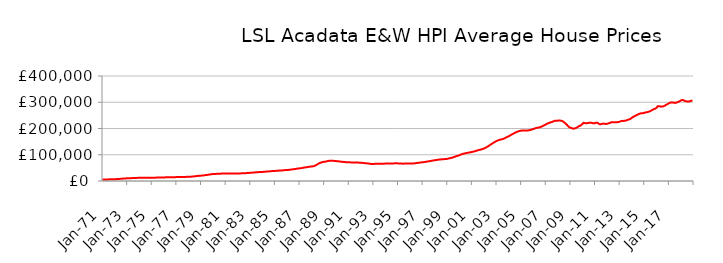
| Category | Series 0 |
|---|---|
| 1971-01-01 | 5778.581 |
| 1971-02-01 | 5819.644 |
| 1971-03-01 | 5861.052 |
| 1971-04-01 | 5914.887 |
| 1971-05-01 | 6004.226 |
| 1971-06-01 | 6097.324 |
| 1971-07-01 | 6211.806 |
| 1971-08-01 | 6336.376 |
| 1971-09-01 | 6459.952 |
| 1971-10-01 | 6588.334 |
| 1971-11-01 | 6726.925 |
| 1971-12-01 | 6895.683 |
| 1972-01-01 | 7012.816 |
| 1972-02-01 | 7089.505 |
| 1972-03-01 | 7264.068 |
| 1972-04-01 | 7508.171 |
| 1972-05-01 | 7860.864 |
| 1972-06-01 | 8170.355 |
| 1972-07-01 | 8526.19 |
| 1972-08-01 | 8869.45 |
| 1972-09-01 | 9172.546 |
| 1972-10-01 | 9455.81 |
| 1972-11-01 | 9718.109 |
| 1972-12-01 | 9988.703 |
| 1973-01-01 | 10182.281 |
| 1973-02-01 | 10319.059 |
| 1973-03-01 | 10476.299 |
| 1973-04-01 | 10655.658 |
| 1973-05-01 | 10885.617 |
| 1973-06-01 | 11035.023 |
| 1973-07-01 | 11191.497 |
| 1973-08-01 | 11365.076 |
| 1973-09-01 | 11567.646 |
| 1973-10-01 | 11777.671 |
| 1973-11-01 | 11937.725 |
| 1973-12-01 | 12052.498 |
| 1974-01-01 | 12114.056 |
| 1974-02-01 | 12180.401 |
| 1974-03-01 | 12177.683 |
| 1974-04-01 | 12151.396 |
| 1974-05-01 | 12128.2 |
| 1974-06-01 | 12129.044 |
| 1974-07-01 | 12140.839 |
| 1974-08-01 | 12180.432 |
| 1974-09-01 | 12252.457 |
| 1974-10-01 | 12340.928 |
| 1974-11-01 | 12414.246 |
| 1974-12-01 | 12486.63 |
| 1975-01-01 | 12520.118 |
| 1975-02-01 | 12562.362 |
| 1975-03-01 | 12637.333 |
| 1975-04-01 | 12744.087 |
| 1975-05-01 | 12873.689 |
| 1975-06-01 | 12943.075 |
| 1975-07-01 | 13011.113 |
| 1975-08-01 | 13105.055 |
| 1975-09-01 | 13232.189 |
| 1975-10-01 | 13373.438 |
| 1975-11-01 | 13497.805 |
| 1975-12-01 | 13630.81 |
| 1976-01-01 | 13724.455 |
| 1976-02-01 | 13812.644 |
| 1976-03-01 | 13872.986 |
| 1976-04-01 | 13937.169 |
| 1976-05-01 | 14021.143 |
| 1976-06-01 | 14076.084 |
| 1976-07-01 | 14136.858 |
| 1976-08-01 | 14226.8 |
| 1976-09-01 | 14355.517 |
| 1976-10-01 | 14500.583 |
| 1976-11-01 | 14616.658 |
| 1976-12-01 | 14720.316 |
| 1977-01-01 | 14777.952 |
| 1977-02-01 | 14844.144 |
| 1977-03-01 | 14887.065 |
| 1977-04-01 | 14937.409 |
| 1977-05-01 | 15015.166 |
| 1977-06-01 | 15085.676 |
| 1977-07-01 | 15172.371 |
| 1977-08-01 | 15291.274 |
| 1977-09-01 | 15436.686 |
| 1977-10-01 | 15600.493 |
| 1977-11-01 | 15773.788 |
| 1977-12-01 | 15999.984 |
| 1978-01-01 | 16167.959 |
| 1978-02-01 | 16299.061 |
| 1978-03-01 | 16475.734 |
| 1978-04-01 | 16713.402 |
| 1978-05-01 | 17094.413 |
| 1978-06-01 | 17479.975 |
| 1978-07-01 | 17946.292 |
| 1978-08-01 | 18424.608 |
| 1978-09-01 | 18884.941 |
| 1978-10-01 | 19342.68 |
| 1978-11-01 | 19769.516 |
| 1978-12-01 | 20191.255 |
| 1979-01-01 | 20442.13 |
| 1979-02-01 | 20610.397 |
| 1979-03-01 | 21029.54 |
| 1979-04-01 | 21604.081 |
| 1979-05-01 | 22337.281 |
| 1979-06-01 | 22802.563 |
| 1979-07-01 | 23285.495 |
| 1979-08-01 | 23829.32 |
| 1979-09-01 | 24480.85 |
| 1979-10-01 | 25176.324 |
| 1979-11-01 | 25755.381 |
| 1979-12-01 | 26205.315 |
| 1980-01-01 | 26452.337 |
| 1980-02-01 | 26644.34 |
| 1980-03-01 | 26890.696 |
| 1980-04-01 | 27179.161 |
| 1980-05-01 | 27516.6 |
| 1980-06-01 | 27697.106 |
| 1980-07-01 | 27860.786 |
| 1980-08-01 | 28012.05 |
| 1980-09-01 | 28118.706 |
| 1980-10-01 | 28187.005 |
| 1980-11-01 | 28239.499 |
| 1980-12-01 | 28351.177 |
| 1981-01-01 | 28417.565 |
| 1981-02-01 | 28518.272 |
| 1981-03-01 | 28619.251 |
| 1981-04-01 | 28754.782 |
| 1981-05-01 | 28892.195 |
| 1981-06-01 | 28938.816 |
| 1981-07-01 | 28961.048 |
| 1981-08-01 | 28966.541 |
| 1981-09-01 | 28911.984 |
| 1981-10-01 | 28812.42 |
| 1981-11-01 | 28721.014 |
| 1981-12-01 | 28711.063 |
| 1982-01-01 | 28666.699 |
| 1982-02-01 | 28686.129 |
| 1982-03-01 | 28845.213 |
| 1982-04-01 | 29113.24 |
| 1982-05-01 | 29413.475 |
| 1982-06-01 | 29523.039 |
| 1982-07-01 | 29605.704 |
| 1982-08-01 | 29763.338 |
| 1982-09-01 | 30018.943 |
| 1982-10-01 | 30322.622 |
| 1982-11-01 | 30625.169 |
| 1982-12-01 | 31000.37 |
| 1983-01-01 | 31285.472 |
| 1983-02-01 | 31530.496 |
| 1983-03-01 | 31785.806 |
| 1983-04-01 | 32102.207 |
| 1983-05-01 | 32517.182 |
| 1983-06-01 | 32842.832 |
| 1983-07-01 | 33197.41 |
| 1983-08-01 | 33534.274 |
| 1983-09-01 | 33803.554 |
| 1983-10-01 | 34023.857 |
| 1983-11-01 | 34231.746 |
| 1983-12-01 | 34504.784 |
| 1984-01-01 | 34667.972 |
| 1984-02-01 | 34833.654 |
| 1984-03-01 | 35148.221 |
| 1984-04-01 | 35584.586 |
| 1984-05-01 | 36084.097 |
| 1984-06-01 | 36305.56 |
| 1984-07-01 | 36490.904 |
| 1984-08-01 | 36773.294 |
| 1984-09-01 | 37223.913 |
| 1984-10-01 | 37745.264 |
| 1984-11-01 | 38148.207 |
| 1984-12-01 | 38428.254 |
| 1985-01-01 | 38505.993 |
| 1985-02-01 | 38613.431 |
| 1985-03-01 | 38877.562 |
| 1985-04-01 | 39248.564 |
| 1985-05-01 | 39672.187 |
| 1985-06-01 | 39835.893 |
| 1985-07-01 | 39987.238 |
| 1985-08-01 | 40249.596 |
| 1985-09-01 | 40687.139 |
| 1985-10-01 | 41186.844 |
| 1985-11-01 | 41606.839 |
| 1985-12-01 | 41942.748 |
| 1986-01-01 | 42073.314 |
| 1986-02-01 | 42206.626 |
| 1986-03-01 | 42596.037 |
| 1986-04-01 | 43159.332 |
| 1986-05-01 | 43862.389 |
| 1986-06-01 | 44288.034 |
| 1986-07-01 | 44723.162 |
| 1986-08-01 | 45242.601 |
| 1986-09-01 | 45895.474 |
| 1986-10-01 | 46600.536 |
| 1986-11-01 | 47240.523 |
| 1986-12-01 | 47837.225 |
| 1987-01-01 | 48183.417 |
| 1987-02-01 | 48470.067 |
| 1987-03-01 | 49091.843 |
| 1987-04-01 | 49929.002 |
| 1987-05-01 | 50929.272 |
| 1987-06-01 | 51493.685 |
| 1987-07-01 | 52033.634 |
| 1987-08-01 | 52627.858 |
| 1987-09-01 | 53272.878 |
| 1987-10-01 | 53940.591 |
| 1987-11-01 | 54566.177 |
| 1987-12-01 | 55214.165 |
| 1988-01-01 | 55522.204 |
| 1988-02-01 | 55787.875 |
| 1988-03-01 | 56717.064 |
| 1988-04-01 | 58115.424 |
| 1988-05-01 | 60219.447 |
| 1988-06-01 | 62342.579 |
| 1988-07-01 | 64842.518 |
| 1988-08-01 | 67142.158 |
| 1988-09-01 | 68912.875 |
| 1988-10-01 | 70383.082 |
| 1988-11-01 | 71565.513 |
| 1988-12-01 | 72615.333 |
| 1989-01-01 | 73164.108 |
| 1989-02-01 | 73628.044 |
| 1989-03-01 | 74415.491 |
| 1989-04-01 | 75418.057 |
| 1989-05-01 | 76480.197 |
| 1989-06-01 | 76944.266 |
| 1989-07-01 | 77260.226 |
| 1989-08-01 | 77408.357 |
| 1989-09-01 | 77280.652 |
| 1989-10-01 | 76923.296 |
| 1989-11-01 | 76447.889 |
| 1989-12-01 | 76060.406 |
| 1990-01-01 | 75711.661 |
| 1990-02-01 | 75697.35 |
| 1990-03-01 | 75177.716 |
| 1990-04-01 | 74503.281 |
| 1990-05-01 | 73714.687 |
| 1990-06-01 | 73338.383 |
| 1990-07-01 | 73017.722 |
| 1990-08-01 | 72705.168 |
| 1990-09-01 | 72265.957 |
| 1990-10-01 | 71763.936 |
| 1990-11-01 | 71298.016 |
| 1990-12-01 | 71100.097 |
| 1991-01-01 | 70960.966 |
| 1991-02-01 | 71035.522 |
| 1991-03-01 | 70922.586 |
| 1991-04-01 | 70847.983 |
| 1991-05-01 | 70749.789 |
| 1991-06-01 | 70705.845 |
| 1991-07-01 | 70659.152 |
| 1991-08-01 | 70593.649 |
| 1991-09-01 | 70481.53 |
| 1991-10-01 | 70280.97 |
| 1991-11-01 | 69952.468 |
| 1991-12-01 | 69605.033 |
| 1992-01-01 | 69260.927 |
| 1992-02-01 | 69208.159 |
| 1992-03-01 | 68725.479 |
| 1992-04-01 | 68142.872 |
| 1992-05-01 | 67499.75 |
| 1992-06-01 | 67289.23 |
| 1992-07-01 | 67137.867 |
| 1992-08-01 | 66820.205 |
| 1992-09-01 | 66142.2 |
| 1992-10-01 | 65300.935 |
| 1992-11-01 | 64730.656 |
| 1992-12-01 | 64747.256 |
| 1993-01-01 | 64907.444 |
| 1993-02-01 | 65190.915 |
| 1993-03-01 | 65445.628 |
| 1993-04-01 | 65764.278 |
| 1993-05-01 | 66035.947 |
| 1993-06-01 | 66067.024 |
| 1993-07-01 | 66086.68 |
| 1993-08-01 | 66141.094 |
| 1993-09-01 | 66099.7 |
| 1993-10-01 | 65980.598 |
| 1993-11-01 | 65902.66 |
| 1993-12-01 | 66133.369 |
| 1994-01-01 | 66450.741 |
| 1994-02-01 | 66846.387 |
| 1994-03-01 | 66831.306 |
| 1994-04-01 | 66669.989 |
| 1994-05-01 | 66528.32 |
| 1994-06-01 | 66541.018 |
| 1994-07-01 | 66620.973 |
| 1994-08-01 | 66785.42 |
| 1994-09-01 | 67046.807 |
| 1994-10-01 | 67363.476 |
| 1994-11-01 | 67513.346 |
| 1994-12-01 | 67424.931 |
| 1995-01-01 | 66930.878 |
| 1995-02-01 | 66505.588 |
| 1995-03-01 | 66345.676 |
| 1995-04-01 | 66179.05 |
| 1995-05-01 | 66207.277 |
| 1995-06-01 | 66066.819 |
| 1995-07-01 | 66210.834 |
| 1995-08-01 | 66274.799 |
| 1995-09-01 | 66312.623 |
| 1995-10-01 | 66288.853 |
| 1995-11-01 | 66372.439 |
| 1995-12-01 | 66453.866 |
| 1996-01-01 | 66477.973 |
| 1996-02-01 | 66437.524 |
| 1996-03-01 | 66657.047 |
| 1996-04-01 | 66916.11 |
| 1996-05-01 | 67408.306 |
| 1996-06-01 | 67768.61 |
| 1996-07-01 | 68356.993 |
| 1996-08-01 | 68926.287 |
| 1996-09-01 | 69501.463 |
| 1996-10-01 | 69920.266 |
| 1996-11-01 | 70364.299 |
| 1996-12-01 | 70992.181 |
| 1997-01-01 | 71442.548 |
| 1997-02-01 | 71922.337 |
| 1997-03-01 | 72332.117 |
| 1997-04-01 | 72997.168 |
| 1997-05-01 | 73865.854 |
| 1997-06-01 | 74525.484 |
| 1997-07-01 | 74991.174 |
| 1997-08-01 | 75733.483 |
| 1997-09-01 | 76397.622 |
| 1997-10-01 | 77257.824 |
| 1997-11-01 | 77859.322 |
| 1997-12-01 | 78623.228 |
| 1998-01-01 | 79076.436 |
| 1998-02-01 | 79757.021 |
| 1998-03-01 | 80350.699 |
| 1998-04-01 | 81087.745 |
| 1998-05-01 | 81611.316 |
| 1998-06-01 | 81932.97 |
| 1998-07-01 | 82318.136 |
| 1998-08-01 | 82678.536 |
| 1998-09-01 | 83043.331 |
| 1998-10-01 | 83285.382 |
| 1998-11-01 | 83567.784 |
| 1998-12-01 | 83907.289 |
| 1999-01-01 | 84409.798 |
| 1999-02-01 | 85413.4 |
| 1999-03-01 | 86298.095 |
| 1999-04-01 | 87175.742 |
| 1999-05-01 | 88136.841 |
| 1999-06-01 | 89153.578 |
| 1999-07-01 | 90350.574 |
| 1999-08-01 | 91899.847 |
| 1999-09-01 | 93479.148 |
| 1999-10-01 | 94930.187 |
| 1999-11-01 | 95915.47 |
| 1999-12-01 | 97238.882 |
| 2000-01-01 | 98294.329 |
| 2000-02-01 | 100197.041 |
| 2000-03-01 | 101690.591 |
| 2000-04-01 | 103282.864 |
| 2000-05-01 | 104088.993 |
| 2000-06-01 | 105077.236 |
| 2000-07-01 | 105958.897 |
| 2000-08-01 | 106780.43 |
| 2000-09-01 | 107543.252 |
| 2000-10-01 | 108326.838 |
| 2000-11-01 | 108972.225 |
| 2000-12-01 | 109793.944 |
| 2001-01-01 | 110459.623 |
| 2001-02-01 | 111492.415 |
| 2001-03-01 | 112458.562 |
| 2001-04-01 | 113645.435 |
| 2001-05-01 | 114925.837 |
| 2001-06-01 | 115987.247 |
| 2001-07-01 | 117144.994 |
| 2001-08-01 | 118298.968 |
| 2001-09-01 | 119344.038 |
| 2001-10-01 | 120045.574 |
| 2001-11-01 | 121242.557 |
| 2001-12-01 | 122568.557 |
| 2002-01-01 | 124340.102 |
| 2002-02-01 | 126061.259 |
| 2002-03-01 | 128117.853 |
| 2002-04-01 | 130332.251 |
| 2002-05-01 | 132832.459 |
| 2002-06-01 | 135364.654 |
| 2002-07-01 | 138137.358 |
| 2002-08-01 | 140600.564 |
| 2002-09-01 | 143214.854 |
| 2002-10-01 | 145663.243 |
| 2002-11-01 | 147814.065 |
| 2002-12-01 | 150182.316 |
| 2003-01-01 | 152294.778 |
| 2003-02-01 | 154028.719 |
| 2003-03-01 | 155430.273 |
| 2003-04-01 | 156771.149 |
| 2003-05-01 | 157909.301 |
| 2003-06-01 | 158824.35 |
| 2003-07-01 | 159630.876 |
| 2003-08-01 | 161216.586 |
| 2003-09-01 | 162872.54 |
| 2003-10-01 | 165036.958 |
| 2003-11-01 | 167138.204 |
| 2003-12-01 | 168897.979 |
| 2004-01-01 | 170648.086 |
| 2004-02-01 | 172981.66 |
| 2004-03-01 | 175255.438 |
| 2004-04-01 | 177312.932 |
| 2004-05-01 | 179520.856 |
| 2004-06-01 | 181595.895 |
| 2004-07-01 | 183588.803 |
| 2004-08-01 | 185637.75 |
| 2004-09-01 | 187263.331 |
| 2004-10-01 | 188949.471 |
| 2004-11-01 | 189891.62 |
| 2004-12-01 | 190886.386 |
| 2005-01-01 | 191651.97 |
| 2005-02-01 | 192756.957 |
| 2005-03-01 | 192653.94 |
| 2005-04-01 | 192730.932 |
| 2005-05-01 | 192129.499 |
| 2005-06-01 | 192629.137 |
| 2005-07-01 | 192637.159 |
| 2005-08-01 | 192884.354 |
| 2005-09-01 | 193456.443 |
| 2005-10-01 | 194586.143 |
| 2005-11-01 | 195531.81 |
| 2005-12-01 | 197150.584 |
| 2006-01-01 | 198153.754 |
| 2006-02-01 | 199813.466 |
| 2006-03-01 | 200983.99 |
| 2006-04-01 | 202245.961 |
| 2006-05-01 | 203065.042 |
| 2006-06-01 | 203685.673 |
| 2006-07-01 | 204559.278 |
| 2006-08-01 | 205714.078 |
| 2006-09-01 | 207431.746 |
| 2006-10-01 | 209492.23 |
| 2006-11-01 | 211163.513 |
| 2006-12-01 | 213373.811 |
| 2007-01-01 | 215210.655 |
| 2007-02-01 | 217819.553 |
| 2007-03-01 | 219232.983 |
| 2007-04-01 | 221043.784 |
| 2007-05-01 | 222128.218 |
| 2007-06-01 | 223865.002 |
| 2007-07-01 | 224582.145 |
| 2007-08-01 | 226402.251 |
| 2007-09-01 | 228182.408 |
| 2007-10-01 | 229491.543 |
| 2007-11-01 | 229231.088 |
| 2007-12-01 | 229404.46 |
| 2008-01-01 | 229854.007 |
| 2008-02-01 | 230778.597 |
| 2008-03-01 | 230153.08 |
| 2008-04-01 | 229721.005 |
| 2008-05-01 | 228299.829 |
| 2008-06-01 | 226513.482 |
| 2008-07-01 | 223227.056 |
| 2008-08-01 | 220141.088 |
| 2008-09-01 | 216463.272 |
| 2008-10-01 | 212510.657 |
| 2008-11-01 | 207922.628 |
| 2008-12-01 | 204675.242 |
| 2009-01-01 | 203165.33 |
| 2009-02-01 | 201911.844 |
| 2009-03-01 | 200225.813 |
| 2009-04-01 | 199383.576 |
| 2009-05-01 | 199859.253 |
| 2009-06-01 | 201412.925 |
| 2009-07-01 | 203027.61 |
| 2009-08-01 | 205323.71 |
| 2009-09-01 | 208069.093 |
| 2009-10-01 | 210492.42 |
| 2009-11-01 | 210907.6 |
| 2009-12-01 | 215086.622 |
| 2010-01-01 | 218354.797 |
| 2010-02-01 | 222015.55 |
| 2010-03-01 | 220623.663 |
| 2010-04-01 | 219905.901 |
| 2010-05-01 | 220113.626 |
| 2010-06-01 | 220921.717 |
| 2010-07-01 | 221564.916 |
| 2010-08-01 | 222318.029 |
| 2010-09-01 | 222269.425 |
| 2010-10-01 | 221434.684 |
| 2010-11-01 | 219854.924 |
| 2010-12-01 | 219866.03 |
| 2011-01-01 | 220405.999 |
| 2011-02-01 | 222145.885 |
| 2011-03-01 | 222431.145 |
| 2011-04-01 | 220277.333 |
| 2011-05-01 | 217364.071 |
| 2011-06-01 | 215781.529 |
| 2011-07-01 | 216886.961 |
| 2011-08-01 | 218462.386 |
| 2011-09-01 | 218447.96 |
| 2011-10-01 | 218746.451 |
| 2011-11-01 | 217505.539 |
| 2011-12-01 | 217590.911 |
| 2012-01-01 | 218300.924 |
| 2012-02-01 | 219064.04 |
| 2012-03-01 | 220982.893 |
| 2012-04-01 | 221888.073 |
| 2012-05-01 | 224080.255 |
| 2012-06-01 | 224094.767 |
| 2012-07-01 | 223904.739 |
| 2012-08-01 | 223391.425 |
| 2012-09-01 | 223676.621 |
| 2012-10-01 | 224076.65 |
| 2012-11-01 | 224222.02 |
| 2012-12-01 | 224932.069 |
| 2013-01-01 | 225725.691 |
| 2013-02-01 | 227657.684 |
| 2013-03-01 | 228536.318 |
| 2013-04-01 | 229161.736 |
| 2013-05-01 | 228933.746 |
| 2013-06-01 | 229215.618 |
| 2013-07-01 | 230067.874 |
| 2013-08-01 | 231582.352 |
| 2013-09-01 | 233071.269 |
| 2013-10-01 | 234544.706 |
| 2013-11-01 | 235649.654 |
| 2013-12-01 | 237829.132 |
| 2014-01-01 | 241172.518 |
| 2014-02-01 | 243555.901 |
| 2014-03-01 | 246091.044 |
| 2014-04-01 | 247497.872 |
| 2014-05-01 | 250020.497 |
| 2014-06-01 | 252131.969 |
| 2014-07-01 | 253728.94 |
| 2014-08-01 | 255600.623 |
| 2014-09-01 | 257111.229 |
| 2014-10-01 | 258073.581 |
| 2014-11-01 | 258087.083 |
| 2014-12-01 | 258355.146 |
| 2015-01-01 | 259818.582 |
| 2015-02-01 | 261058.597 |
| 2015-03-01 | 261701.1 |
| 2015-04-01 | 262401.663 |
| 2015-05-01 | 263522.572 |
| 2015-06-01 | 265038.057 |
| 2015-07-01 | 266149.558 |
| 2015-08-01 | 268751.273 |
| 2015-09-01 | 270772.804 |
| 2015-10-01 | 273642.208 |
| 2015-11-01 | 274283.861 |
| 2015-12-01 | 276419.926 |
| 2016-01-01 | 278666.894 |
| 2016-02-01 | 284429.326 |
| 2016-03-01 | 284960.108 |
| 2016-04-01 | 284944.646 |
| 2016-05-01 | 282948.008 |
| 2016-06-01 | 283814.098 |
| 2016-07-01 | 284190.963 |
| 2016-08-01 | 285049.367 |
| 2016-09-01 | 286912.583 |
| 2016-10-01 | 289670.712 |
| 2016-11-01 | 291498.925 |
| 2016-12-01 | 293660.755 |
| 2017-01-01 | 296049.718 |
| 2017-02-01 | 297925.212 |
| 2017-03-01 | 299528.983 |
| 2017-04-01 | 299440.056 |
| 2017-05-01 | 299197.318 |
| 2017-06-01 | 297881.634 |
| 2017-07-01 | 297572.583 |
| 2017-08-01 | 297921.55 |
| 2017-09-01 | 299872.805 |
| 2017-10-01 | 301440.248 |
| 2017-11-01 | 302810.256 |
| 2017-12-01 | 304956.779 |
| 2018-01-01 | 307430.463 |
| 2018-02-01 | 308860.612 |
| 2018-03-01 | 307961.275 |
| 2018-04-01 | 305862.067 |
| 2018-05-01 | 304370.235 |
| 2018-06-01 | 303775.008 |
| 2018-07-01 | 302835.456 |
| 2018-08-01 | 303244.213 |
| 2018-09-01 | 303269.869 |
| 2018-10-01 | 304991.868 |
| 2018-11-01 | 305769.404 |
| 2018-12-01 | 306647.128 |